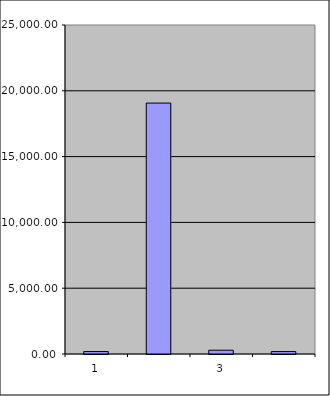
| Category | Series 0 |
|---|---|
| 0 | 185.5 |
| 1 | 19068.045 |
| 2 | 286.824 |
| 3 | 184.799 |